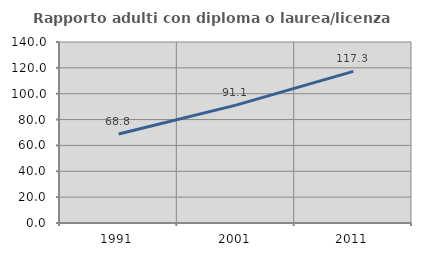
| Category | Rapporto adulti con diploma o laurea/licenza media  |
|---|---|
| 1991.0 | 68.844 |
| 2001.0 | 91.147 |
| 2011.0 | 117.269 |